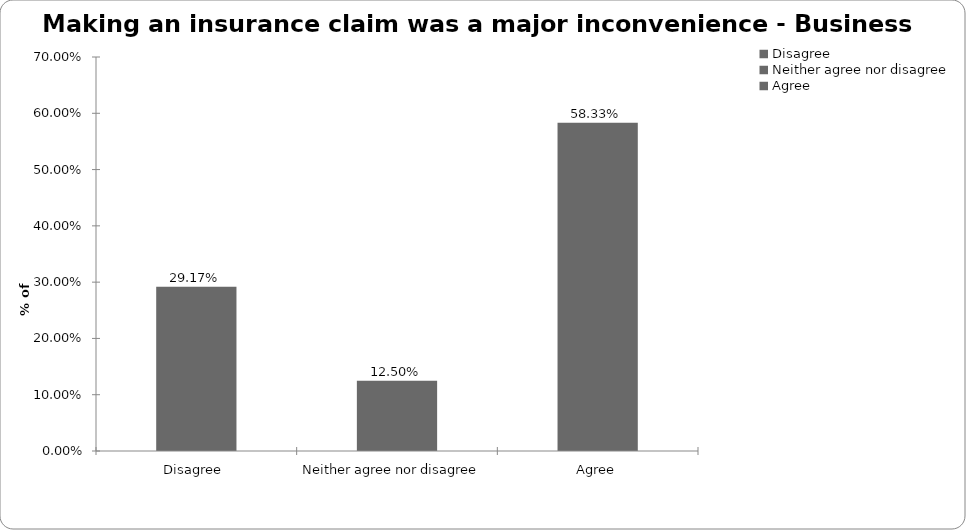
| Category | Business Interruption |
|---|---|
| Disagree  | 0.292 |
| Neither agree nor disagree  | 0.125 |
| Agree | 0.583 |